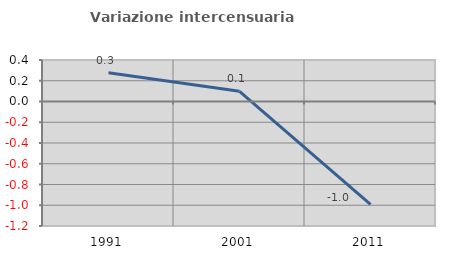
| Category | Variazione intercensuaria annua |
|---|---|
| 1991.0 | 0.277 |
| 2001.0 | 0.098 |
| 2011.0 | -0.991 |